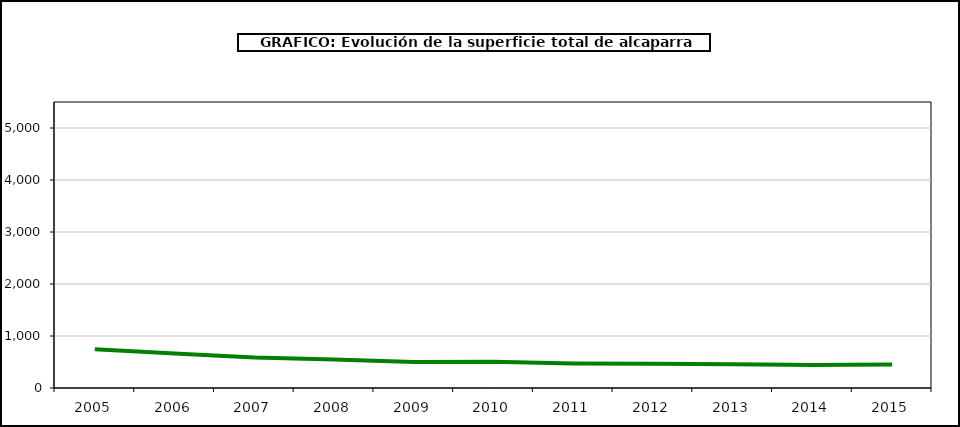
| Category | superficie |
|---|---|
| 2005.0 | 747 |
| 2006.0 | 662 |
| 2007.0 | 588 |
| 2008.0 | 548 |
| 2009.0 | 501 |
| 2010.0 | 504 |
| 2011.0 | 471 |
| 2012.0 | 467 |
| 2013.0 | 456 |
| 2014.0 | 443 |
| 2015.0 | 450 |